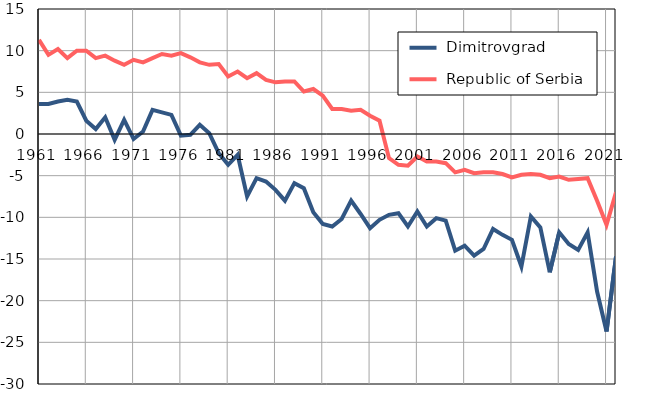
| Category |  Dimitrovgrad |  Republic of Serbia |
|---|---|---|
| 1961.0 | 3.6 | 11.3 |
| 1962.0 | 3.6 | 9.5 |
| 1963.0 | 3.9 | 10.2 |
| 1964.0 | 4.1 | 9.1 |
| 1965.0 | 3.9 | 10 |
| 1966.0 | 1.6 | 10 |
| 1967.0 | 0.6 | 9.1 |
| 1968.0 | 2 | 9.4 |
| 1969.0 | -0.7 | 8.8 |
| 1970.0 | 1.7 | 8.3 |
| 1971.0 | -0.6 | 8.9 |
| 1972.0 | 0.3 | 8.6 |
| 1973.0 | 2.9 | 9.1 |
| 1974.0 | 2.6 | 9.6 |
| 1975.0 | 2.3 | 9.4 |
| 1976.0 | -0.2 | 9.7 |
| 1977.0 | -0.1 | 9.2 |
| 1978.0 | 1.1 | 8.6 |
| 1979.0 | 0.1 | 8.3 |
| 1980.0 | -2.3 | 8.4 |
| 1981.0 | -3.7 | 6.9 |
| 1982.0 | -2.5 | 7.5 |
| 1983.0 | -7.5 | 6.7 |
| 1984.0 | -5.3 | 7.3 |
| 1985.0 | -5.7 | 6.5 |
| 1986.0 | -6.7 | 6.2 |
| 1987.0 | -8 | 6.3 |
| 1988.0 | -5.9 | 6.3 |
| 1989.0 | -6.5 | 5.1 |
| 1990.0 | -9.4 | 5.4 |
| 1991.0 | -10.8 | 4.6 |
| 1992.0 | -11.1 | 3 |
| 1993.0 | -10.2 | 3 |
| 1994.0 | -8 | 2.8 |
| 1995.0 | -9.6 | 2.9 |
| 1996.0 | -11.3 | 2.2 |
| 1997.0 | -10.3 | 1.6 |
| 1998.0 | -9.7 | -2.9 |
| 1999.0 | -9.5 | -3.7 |
| 2000.0 | -11.1 | -3.8 |
| 2001.0 | -9.3 | -2.7 |
| 2002.0 | -11.1 | -3.3 |
| 2003.0 | -10.1 | -3.3 |
| 2004.0 | -10.4 | -3.5 |
| 2005.0 | -14 | -4.6 |
| 2006.0 | -13.4 | -4.3 |
| 2007.0 | -14.6 | -4.7 |
| 2008.0 | -13.8 | -4.6 |
| 2009.0 | -11.4 | -4.6 |
| 2010.0 | -12.1 | -4.8 |
| 2011.0 | -12.7 | -5.2 |
| 2012.0 | -15.9 | -4.9 |
| 2013.0 | -9.9 | -4.8 |
| 2014.0 | -11.2 | -4.9 |
| 2015.0 | -16.6 | -5.3 |
| 2016.0 | -11.8 | -5.1 |
| 2017.0 | -13.2 | -5.5 |
| 2018.0 | -13.9 | -5.4 |
| 2019.0 | -11.8 | -5.3 |
| 2020.0 | -18.9 | -8 |
| 2021.0 | -23.7 | -10.9 |
| 2022.0 | -14.7 | -7 |